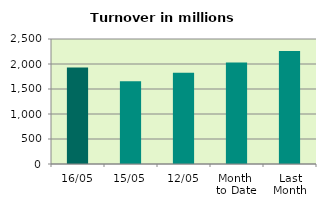
| Category | Series 0 |
|---|---|
| 16/05 | 1928.788 |
| 15/05 | 1656.728 |
| 12/05 | 1824.599 |
| Month 
to Date | 2030.951 |
| Last
Month | 2261.282 |